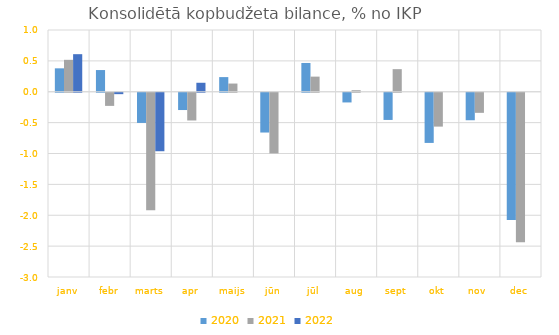
| Category | 2020 | 2021 | 2022 |
|---|---|---|---|
| janv | 0.379 | 0.517 | 0.608 |
| febr | 0.351 | -0.213 | -0.023 |
| marts | -0.489 | -1.903 | -0.947 |
| apr | -0.28 | -0.449 | 0.146 |
| maijs | 0.237 | 0.133 | 0 |
| jūn | -0.644 | -0.982 | 0 |
| jūl | 0.466 | 0.245 | 0 |
| aug | -0.157 | 0.025 | 0 |
| sept | -0.44 | 0.366 | 0 |
| okt | -0.813 | -0.548 | 0 |
| nov | -0.445 | -0.325 | 0 |
| dec | -2.059 | -2.42 | 0 |